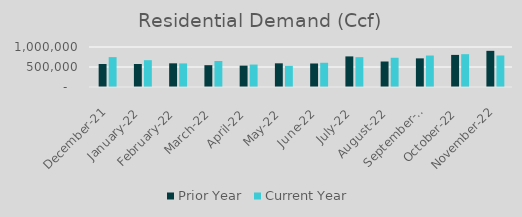
| Category | Prior Year | Current Year |
|---|---|---|
| 2021-12-01 | 575698.992 | 746791.488 |
| 2022-01-01 | 574964.407 | 670556.394 |
| 2022-02-01 | 591912.627 | 589693.822 |
| 2022-03-01 | 545392.69 | 650741.307 |
| 2022-04-01 | 533967.423 | 560920.541 |
| 2022-05-01 | 591911.753 | 528033 |
| 2022-06-01 | 587861.265 | 605957.158 |
| 2022-07-01 | 764849.567 | 746133 |
| 2022-08-01 | 637451.79 | 730870.571 |
| 2022-09-01 | 715703.433 | 786683 |
| 2022-10-01 | 802383.882 | 820653 |
| 2022-11-01 | 904247.352 | 787530.042 |